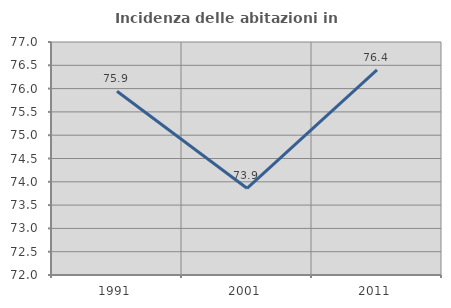
| Category | Incidenza delle abitazioni in proprietà  |
|---|---|
| 1991.0 | 75.944 |
| 2001.0 | 73.86 |
| 2011.0 | 76.4 |